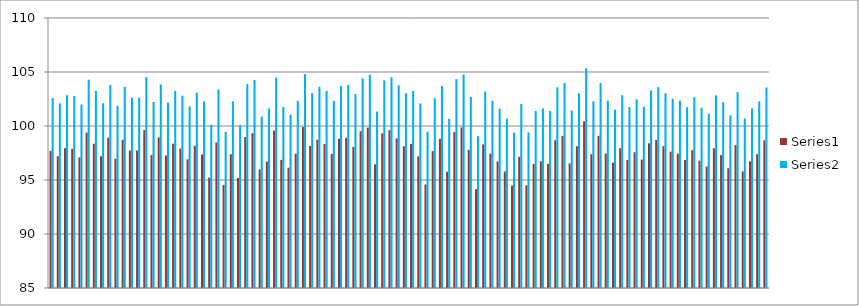
| Category | Series 1 | Series 2 |
|---|---|---|
| 0 | 97.689 | 102.589 |
| 1 | 97.193 | 102.093 |
| 2 | 97.941 | 102.84 |
| 3 | 97.881 | 102.78 |
| 4 | 97.093 | 101.992 |
| 5 | 99.393 | 104.293 |
| 6 | 98.355 | 103.254 |
| 7 | 97.203 | 102.103 |
| 8 | 98.915 | 103.815 |
| 9 | 96.975 | 101.875 |
| 10 | 98.72 | 103.62 |
| 11 | 97.723 | 102.623 |
| 12 | 97.728 | 102.628 |
| 13 | 99.627 | 104.527 |
| 14 | 97.321 | 102.221 |
| 15 | 98.946 | 103.846 |
| 16 | 97.271 | 102.17 |
| 17 | 98.36 | 103.26 |
| 18 | 97.908 | 102.808 |
| 19 | 96.917 | 101.817 |
| 20 | 98.176 | 103.076 |
| 21 | 97.367 | 102.267 |
| 22 | 95.227 | 100.127 |
| 23 | 98.479 | 103.379 |
| 24 | 94.542 | 99.441 |
| 25 | 97.383 | 102.283 |
| 26 | 95.186 | 100.085 |
| 27 | 98.981 | 103.881 |
| 28 | 99.354 | 104.254 |
| 29 | 95.98 | 100.88 |
| 30 | 96.716 | 101.616 |
| 31 | 99.571 | 104.471 |
| 32 | 96.865 | 101.765 |
| 33 | 96.143 | 101.042 |
| 34 | 97.443 | 102.343 |
| 35 | 99.907 | 104.807 |
| 36 | 98.147 | 103.047 |
| 37 | 98.729 | 103.629 |
| 38 | 98.349 | 103.249 |
| 39 | 97.419 | 102.319 |
| 40 | 98.82 | 103.72 |
| 41 | 98.908 | 103.807 |
| 42 | 98.064 | 102.964 |
| 43 | 99.522 | 104.422 |
| 44 | 99.848 | 104.748 |
| 45 | 96.445 | 101.345 |
| 46 | 99.322 | 104.222 |
| 47 | 99.611 | 104.511 |
| 48 | 98.86 | 103.76 |
| 49 | 98.122 | 103.022 |
| 50 | 98.346 | 103.246 |
| 51 | 97.191 | 102.091 |
| 52 | 94.584 | 99.484 |
| 53 | 97.672 | 102.572 |
| 54 | 98.808 | 103.708 |
| 55 | 95.766 | 100.666 |
| 56 | 99.437 | 104.337 |
| 57 | 99.871 | 104.771 |
| 58 | 97.792 | 102.692 |
| 59 | 94.15 | 99.05 |
| 60 | 98.291 | 103.191 |
| 61 | 97.446 | 102.346 |
| 62 | 96.719 | 101.619 |
| 63 | 95.787 | 100.687 |
| 64 | 94.495 | 99.394 |
| 65 | 97.139 | 102.039 |
| 66 | 94.509 | 99.409 |
| 67 | 96.491 | 101.391 |
| 68 | 96.727 | 101.627 |
| 69 | 96.492 | 101.392 |
| 70 | 98.688 | 103.588 |
| 71 | 99.091 | 103.99 |
| 72 | 96.535 | 101.435 |
| 73 | 98.128 | 103.028 |
| 74 | 100.442 | 105.342 |
| 75 | 97.385 | 102.285 |
| 76 | 99.088 | 103.988 |
| 77 | 97.449 | 102.348 |
| 78 | 96.609 | 101.509 |
| 79 | 97.945 | 102.845 |
| 80 | 96.862 | 101.762 |
| 81 | 97.565 | 102.465 |
| 82 | 96.89 | 101.79 |
| 83 | 98.396 | 103.296 |
| 84 | 98.699 | 103.599 |
| 85 | 98.137 | 103.037 |
| 86 | 97.625 | 102.525 |
| 87 | 97.436 | 102.336 |
| 88 | 96.845 | 101.745 |
| 89 | 97.765 | 102.665 |
| 90 | 96.787 | 101.687 |
| 91 | 96.249 | 101.149 |
| 92 | 97.931 | 102.831 |
| 93 | 97.309 | 102.209 |
| 94 | 96.089 | 100.989 |
| 95 | 98.235 | 103.135 |
| 96 | 95.798 | 100.698 |
| 97 | 96.733 | 101.633 |
| 98 | 97.385 | 102.285 |
| 99 | 98.675 | 103.575 |